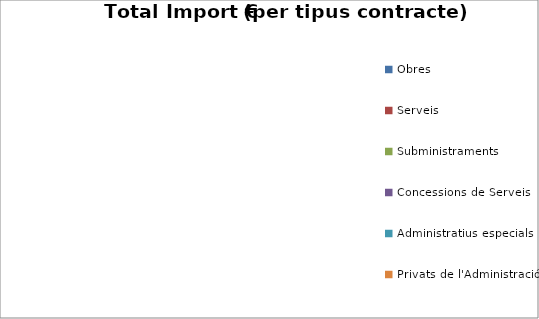
| Category | Total preu              (amb iva) |
|---|---|
| Obres | 0 |
| Serveis | 0 |
| Subministraments | 0 |
| Concessions de Serveis | 0 |
| Administratius especials | 0 |
| Privats de l'Administració | 0 |